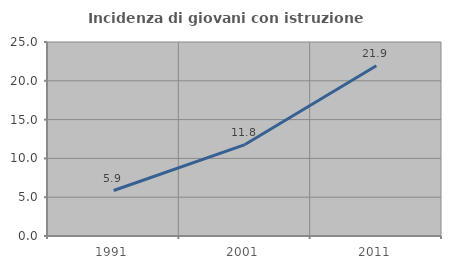
| Category | Incidenza di giovani con istruzione universitaria |
|---|---|
| 1991.0 | 5.863 |
| 2001.0 | 11.782 |
| 2011.0 | 21.937 |